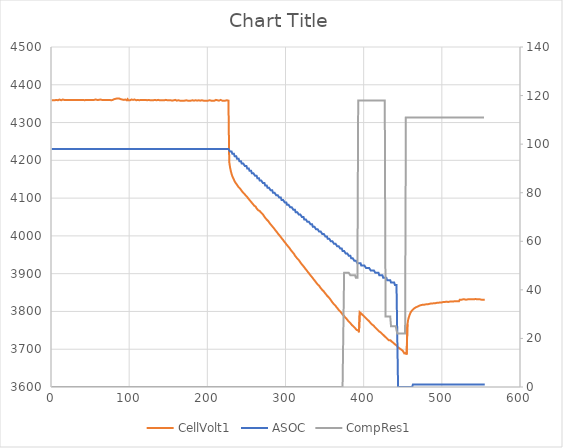
| Category | CellVolt1 |
|---|---|
| 1.0 | 4359 |
| 2.0 | 4360 |
| 3.0 | 4359 |
| 4.0 | 4359 |
| 5.0 | 4359 |
| 6.0 | 4359 |
| 7.0 | 4360 |
| 8.0 | 4360 |
| 9.0 | 4359 |
| 10.0 | 4360 |
| 11.0 | 4361 |
| 12.0 | 4359 |
| 13.0 | 4359 |
| 14.0 | 4359 |
| 15.0 | 4361 |
| 16.0 | 4360 |
| 17.0 | 4360 |
| 18.0 | 4360 |
| 19.0 | 4360 |
| 20.0 | 4361 |
| 21.0 | 4360 |
| 22.0 | 4360 |
| 23.0 | 4360 |
| 24.0 | 4361 |
| 25.0 | 4360 |
| 26.0 | 4360 |
| 27.0 | 4360 |
| 28.0 | 4360 |
| 29.0 | 4360 |
| 30.0 | 4360 |
| 31.0 | 4360 |
| 32.0 | 4360 |
| 33.0 | 4360 |
| 34.0 | 4360 |
| 35.0 | 4360 |
| 36.0 | 4360 |
| 37.0 | 4360 |
| 38.0 | 4360 |
| 39.0 | 4360 |
| 40.0 | 4361 |
| 41.0 | 4360 |
| 42.0 | 4360 |
| 43.0 | 4359 |
| 44.0 | 4360 |
| 45.0 | 4360 |
| 46.0 | 4360 |
| 47.0 | 4360 |
| 48.0 | 4361 |
| 49.0 | 4360 |
| 50.0 | 4360 |
| 51.0 | 4360 |
| 52.0 | 4360 |
| 53.0 | 4360 |
| 54.0 | 4360 |
| 55.0 | 4360 |
| 56.0 | 4359 |
| 57.0 | 4361 |
| 58.0 | 4360 |
| 59.0 | 4360 |
| 60.0 | 4360 |
| 61.0 | 4360 |
| 62.0 | 4360 |
| 63.0 | 4361 |
| 64.0 | 4360 |
| 65.0 | 4360 |
| 66.0 | 4360 |
| 67.0 | 4360 |
| 68.0 | 4360 |
| 69.0 | 4360 |
| 70.0 | 4360 |
| 71.0 | 4360 |
| 72.0 | 4360 |
| 73.0 | 4360 |
| 74.0 | 4360 |
| 75.0 | 4360 |
| 76.0 | 4360 |
| 77.0 | 4359 |
| 78.0 | 4360 |
| 79.0 | 4360 |
| 80.0 | 4360 |
| 81.0 | 4362 |
| 82.0 | 4361 |
| 83.0 | 4363 |
| 84.0 | 4363 |
| 85.0 | 4364 |
| 86.0 | 4364 |
| 87.0 | 4364 |
| 88.0 | 4363 |
| 89.0 | 4362 |
| 90.0 | 4362 |
| 91.0 | 4361 |
| 92.0 | 4361 |
| 93.0 | 4360 |
| 94.0 | 4361 |
| 95.0 | 4361 |
| 96.0 | 4361 |
| 97.0 | 4359 |
| 98.0 | 4362 |
| 99.0 | 4359 |
| 100.0 | 4360 |
| 101.0 | 4359 |
| 102.0 | 4360 |
| 103.0 | 4361 |
| 104.0 | 4361 |
| 105.0 | 4360 |
| 106.0 | 4360 |
| 107.0 | 4361 |
| 108.0 | 4361 |
| 109.0 | 4359 |
| 110.0 | 4360 |
| 111.0 | 4360 |
| 112.0 | 4361 |
| 113.0 | 4359 |
| 114.0 | 4359 |
| 115.0 | 4360 |
| 116.0 | 4360 |
| 117.0 | 4360 |
| 118.0 | 4360 |
| 119.0 | 4360 |
| 120.0 | 4360 |
| 121.0 | 4360 |
| 122.0 | 4360 |
| 123.0 | 4359 |
| 124.0 | 4360 |
| 125.0 | 4360 |
| 126.0 | 4360 |
| 127.0 | 4359 |
| 128.0 | 4360 |
| 129.0 | 4359 |
| 130.0 | 4359 |
| 131.0 | 4359 |
| 132.0 | 4360 |
| 133.0 | 4360 |
| 134.0 | 4359 |
| 135.0 | 4359 |
| 136.0 | 4359 |
| 137.0 | 4360 |
| 138.0 | 4359 |
| 139.0 | 4359 |
| 140.0 | 4359 |
| 141.0 | 4359 |
| 142.0 | 4359 |
| 143.0 | 4359 |
| 144.0 | 4358 |
| 145.0 | 4359 |
| 146.0 | 4358 |
| 147.0 | 4360 |
| 148.0 | 4360 |
| 149.0 | 4359 |
| 150.0 | 4358 |
| 151.0 | 4359 |
| 152.0 | 4358 |
| 153.0 | 4359 |
| 154.0 | 4358 |
| 155.0 | 4358 |
| 156.0 | 4359 |
| 157.0 | 4359 |
| 158.0 | 4360 |
| 159.0 | 4360 |
| 160.0 | 4358 |
| 161.0 | 4358 |
| 162.0 | 4358 |
| 163.0 | 4359 |
| 164.0 | 4358 |
| 165.0 | 4358 |
| 166.0 | 4360 |
| 167.0 | 4358 |
| 168.0 | 4358 |
| 169.0 | 4358 |
| 170.0 | 4358 |
| 171.0 | 4358 |
| 172.0 | 4359 |
| 173.0 | 4359 |
| 174.0 | 4359 |
| 175.0 | 4358 |
| 176.0 | 4359 |
| 177.0 | 4358 |
| 178.0 | 4358 |
| 179.0 | 4358 |
| 180.0 | 4358 |
| 181.0 | 4359 |
| 182.0 | 4358 |
| 183.0 | 4358 |
| 184.0 | 4358 |
| 185.0 | 4359 |
| 186.0 | 4359 |
| 187.0 | 4358 |
| 188.0 | 4358 |
| 189.0 | 4359 |
| 190.0 | 4359 |
| 191.0 | 4358 |
| 192.0 | 4358 |
| 193.0 | 4359 |
| 194.0 | 4358 |
| 195.0 | 4358 |
| 196.0 | 4358 |
| 197.0 | 4358 |
| 198.0 | 4358 |
| 199.0 | 4358 |
| 200.0 | 4358 |
| 201.0 | 4358 |
| 202.0 | 4359 |
| 203.0 | 4359 |
| 204.0 | 4358 |
| 205.0 | 4358 |
| 206.0 | 4358 |
| 207.0 | 4358 |
| 208.0 | 4359 |
| 209.0 | 4358 |
| 210.0 | 4358 |
| 211.0 | 4360 |
| 212.0 | 4358 |
| 213.0 | 4359 |
| 214.0 | 4358 |
| 215.0 | 4358 |
| 216.0 | 4358 |
| 217.0 | 4360 |
| 218.0 | 4359 |
| 219.0 | 4358 |
| 220.0 | 4359 |
| 221.0 | 4358 |
| 222.0 | 4358 |
| 223.0 | 4358 |
| 224.0 | 4359 |
| 225.0 | 4359 |
| 226.0 | 4358 |
| 227.0 | 4358 |
| 228.0 | 4196 |
| 229.0 | 4182 |
| 230.0 | 4172 |
| 231.0 | 4164 |
| 232.0 | 4158 |
| 233.0 | 4153 |
| 234.0 | 4149 |
| 235.0 | 4144 |
| 236.0 | 4141 |
| 237.0 | 4138 |
| 238.0 | 4135 |
| 239.0 | 4132 |
| 240.0 | 4129 |
| 241.0 | 4127 |
| 242.0 | 4125 |
| 243.0 | 4122 |
| 244.0 | 4119 |
| 245.0 | 4117 |
| 246.0 | 4114 |
| 247.0 | 4112 |
| 248.0 | 4110 |
| 249.0 | 4107 |
| 250.0 | 4105 |
| 251.0 | 4103 |
| 252.0 | 4100 |
| 253.0 | 4098 |
| 254.0 | 4095 |
| 255.0 | 4093 |
| 256.0 | 4090 |
| 257.0 | 4088 |
| 258.0 | 4085 |
| 259.0 | 4083 |
| 260.0 | 4080 |
| 261.0 | 4078 |
| 262.0 | 4077 |
| 263.0 | 4073 |
| 264.0 | 4074 |
| 265.0 | 4068 |
| 266.0 | 4066 |
| 267.0 | 4066 |
| 268.0 | 4064 |
| 269.0 | 4061 |
| 270.0 | 4059 |
| 271.0 | 4057 |
| 272.0 | 4054 |
| 273.0 | 4051 |
| 274.0 | 4048 |
| 275.0 | 4047 |
| 276.0 | 4043 |
| 277.0 | 4041 |
| 278.0 | 4039 |
| 279.0 | 4036 |
| 280.0 | 4033 |
| 281.0 | 4031 |
| 282.0 | 4028 |
| 283.0 | 4026 |
| 284.0 | 4023 |
| 285.0 | 4021 |
| 286.0 | 4018 |
| 287.0 | 4015 |
| 288.0 | 4013 |
| 289.0 | 4010 |
| 290.0 | 4007 |
| 291.0 | 4005 |
| 292.0 | 4002 |
| 293.0 | 4000 |
| 294.0 | 3997 |
| 295.0 | 3994 |
| 296.0 | 3992 |
| 297.0 | 3989 |
| 298.0 | 3986 |
| 299.0 | 3984 |
| 300.0 | 3981 |
| 301.0 | 3978 |
| 302.0 | 3976 |
| 303.0 | 3973 |
| 304.0 | 3971 |
| 305.0 | 3968 |
| 306.0 | 3965 |
| 307.0 | 3962 |
| 308.0 | 3961 |
| 309.0 | 3957 |
| 310.0 | 3955 |
| 311.0 | 3952 |
| 312.0 | 3948 |
| 313.0 | 3946 |
| 314.0 | 3943 |
| 315.0 | 3940 |
| 316.0 | 3939 |
| 317.0 | 3936 |
| 318.0 | 3933 |
| 319.0 | 3930 |
| 320.0 | 3927 |
| 321.0 | 3925 |
| 322.0 | 3922 |
| 323.0 | 3920 |
| 324.0 | 3917 |
| 325.0 | 3914 |
| 326.0 | 3912 |
| 327.0 | 3909 |
| 328.0 | 3906 |
| 329.0 | 3904 |
| 330.0 | 3901 |
| 331.0 | 3898 |
| 332.0 | 3896 |
| 333.0 | 3893 |
| 334.0 | 3891 |
| 335.0 | 3888 |
| 336.0 | 3885 |
| 337.0 | 3883 |
| 338.0 | 3880 |
| 339.0 | 3877 |
| 340.0 | 3875 |
| 341.0 | 3872 |
| 342.0 | 3870 |
| 343.0 | 3868 |
| 344.0 | 3865 |
| 345.0 | 3862 |
| 346.0 | 3860 |
| 347.0 | 3857 |
| 348.0 | 3855 |
| 349.0 | 3853 |
| 350.0 | 3850 |
| 351.0 | 3848 |
| 352.0 | 3845 |
| 353.0 | 3842 |
| 354.0 | 3840 |
| 355.0 | 3838 |
| 356.0 | 3836 |
| 357.0 | 3833 |
| 358.0 | 3830 |
| 359.0 | 3828 |
| 360.0 | 3824 |
| 361.0 | 3822 |
| 362.0 | 3819 |
| 363.0 | 3817 |
| 364.0 | 3815 |
| 365.0 | 3812 |
| 366.0 | 3810 |
| 367.0 | 3807 |
| 368.0 | 3804 |
| 369.0 | 3802 |
| 370.0 | 3800 |
| 371.0 | 3798 |
| 372.0 | 3795 |
| 373.0 | 3792 |
| 374.0 | 3790 |
| 375.0 | 3788 |
| 376.0 | 3785 |
| 377.0 | 3783 |
| 378.0 | 3781 |
| 379.0 | 3778 |
| 380.0 | 3776 |
| 381.0 | 3773 |
| 382.0 | 3771 |
| 383.0 | 3769 |
| 384.0 | 3767 |
| 385.0 | 3764 |
| 386.0 | 3762 |
| 387.0 | 3760 |
| 388.0 | 3758 |
| 389.0 | 3756 |
| 390.0 | 3754 |
| 391.0 | 3751 |
| 392.0 | 3749 |
| 393.0 | 3750 |
| 394.0 | 3745 |
| 395.0 | 3798 |
| 396.0 | 3796 |
| 397.0 | 3794 |
| 398.0 | 3792 |
| 399.0 | 3790 |
| 400.0 | 3788 |
| 401.0 | 3786 |
| 402.0 | 3784 |
| 403.0 | 3782 |
| 404.0 | 3781 |
| 405.0 | 3778 |
| 406.0 | 3776 |
| 407.0 | 3774 |
| 408.0 | 3772 |
| 409.0 | 3769 |
| 410.0 | 3768 |
| 411.0 | 3765 |
| 412.0 | 3763 |
| 413.0 | 3762 |
| 414.0 | 3759 |
| 415.0 | 3757 |
| 416.0 | 3755 |
| 417.0 | 3753 |
| 418.0 | 3751 |
| 419.0 | 3749 |
| 420.0 | 3747 |
| 421.0 | 3745 |
| 422.0 | 3744 |
| 423.0 | 3742 |
| 424.0 | 3740 |
| 425.0 | 3742 |
| 426.0 | 3736 |
| 427.0 | 3734 |
| 428.0 | 3732 |
| 429.0 | 3730 |
| 430.0 | 3728 |
| 431.0 | 3726 |
| 432.0 | 3724 |
| 433.0 | 3726 |
| 434.0 | 3724 |
| 435.0 | 3723 |
| 436.0 | 3720 |
| 437.0 | 3718 |
| 438.0 | 3717 |
| 439.0 | 3715 |
| 440.0 | 3713 |
| 441.0 | 3711 |
| 442.0 | 3710 |
| 443.0 | 3708 |
| 444.0 | 3705 |
| 445.0 | 3704 |
| 446.0 | 3702 |
| 447.0 | 3700 |
| 448.0 | 3699 |
| 449.0 | 3697 |
| 450.0 | 3696 |
| 451.0 | 3695 |
| 452.0 | 3689 |
| 453.0 | 3691 |
| 454.0 | 3690 |
| 455.0 | 3686 |
| 456.0 | 3766 |
| 457.0 | 3779 |
| 458.0 | 3786 |
| 459.0 | 3792 |
| 460.0 | 3797 |
| 461.0 | 3800 |
| 462.0 | 3803 |
| 463.0 | 3805 |
| 464.0 | 3807 |
| 465.0 | 3808 |
| 466.0 | 3810 |
| 467.0 | 3812 |
| 468.0 | 3812 |
| 469.0 | 3813 |
| 470.0 | 3814 |
| 471.0 | 3815 |
| 472.0 | 3816 |
| 473.0 | 3815 |
| 474.0 | 3817 |
| 475.0 | 3818 |
| 476.0 | 3818 |
| 477.0 | 3819 |
| 478.0 | 3818 |
| 479.0 | 3819 |
| 480.0 | 3819 |
| 481.0 | 3820 |
| 482.0 | 3819 |
| 483.0 | 3819 |
| 484.0 | 3820 |
| 485.0 | 3820 |
| 486.0 | 3821 |
| 487.0 | 3821 |
| 488.0 | 3821 |
| 489.0 | 3822 |
| 490.0 | 3822 |
| 491.0 | 3822 |
| 492.0 | 3822 |
| 493.0 | 3823 |
| 494.0 | 3823 |
| 495.0 | 3823 |
| 496.0 | 3823 |
| 497.0 | 3824 |
| 498.0 | 3824 |
| 499.0 | 3824 |
| 500.0 | 3824 |
| 501.0 | 3825 |
| 502.0 | 3825 |
| 503.0 | 3825 |
| 504.0 | 3825 |
| 505.0 | 3825 |
| 506.0 | 3826 |
| 507.0 | 3825 |
| 508.0 | 3825 |
| 509.0 | 3826 |
| 510.0 | 3826 |
| 511.0 | 3826 |
| 512.0 | 3826 |
| 513.0 | 3826 |
| 514.0 | 3826 |
| 515.0 | 3826 |
| 516.0 | 3827 |
| 517.0 | 3827 |
| 518.0 | 3827 |
| 519.0 | 3827 |
| 520.0 | 3827 |
| 521.0 | 3827 |
| 522.0 | 3827 |
| 523.0 | 3831 |
| 524.0 | 3831 |
| 525.0 | 3831 |
| 526.0 | 3831 |
| 527.0 | 3832 |
| 528.0 | 3831 |
| 529.0 | 3832 |
| 530.0 | 3831 |
| 531.0 | 3831 |
| 532.0 | 3832 |
| 533.0 | 3832 |
| 534.0 | 3832 |
| 535.0 | 3832 |
| 536.0 | 3832 |
| 537.0 | 3832 |
| 538.0 | 3832 |
| 539.0 | 3832 |
| 540.0 | 3832 |
| 541.0 | 3832 |
| 542.0 | 3832 |
| 543.0 | 3833 |
| 544.0 | 3833 |
| 545.0 | 3832 |
| 546.0 | 3832 |
| 547.0 | 3832 |
| 548.0 | 3833 |
| 549.0 | 3832 |
| 550.0 | 3833 |
| 551.0 | 3831 |
| 552.0 | 3831 |
| 553.0 | 3831 |
| 554.0 | 3831 |
| 555.0 | 3831 |